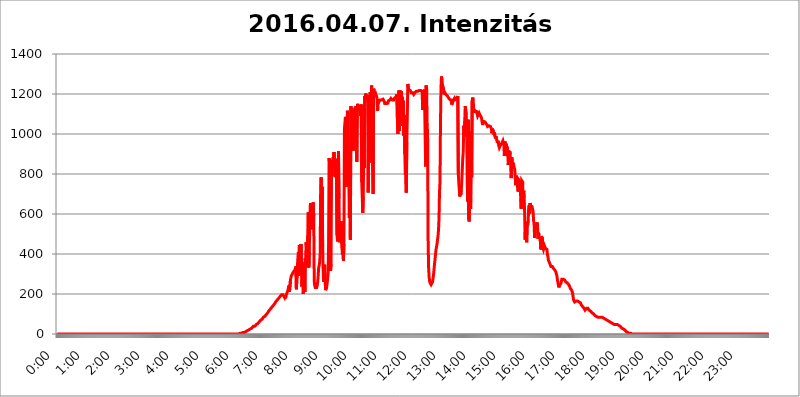
| Category | 2016.04.07. Intenzitás [W/m^2] |
|---|---|
| 0.0 | 0 |
| 0.0006944444444444445 | 0 |
| 0.001388888888888889 | 0 |
| 0.0020833333333333333 | 0 |
| 0.002777777777777778 | 0 |
| 0.003472222222222222 | 0 |
| 0.004166666666666667 | 0 |
| 0.004861111111111111 | 0 |
| 0.005555555555555556 | 0 |
| 0.0062499999999999995 | 0 |
| 0.006944444444444444 | 0 |
| 0.007638888888888889 | 0 |
| 0.008333333333333333 | 0 |
| 0.009027777777777779 | 0 |
| 0.009722222222222222 | 0 |
| 0.010416666666666666 | 0 |
| 0.011111111111111112 | 0 |
| 0.011805555555555555 | 0 |
| 0.012499999999999999 | 0 |
| 0.013194444444444444 | 0 |
| 0.013888888888888888 | 0 |
| 0.014583333333333332 | 0 |
| 0.015277777777777777 | 0 |
| 0.015972222222222224 | 0 |
| 0.016666666666666666 | 0 |
| 0.017361111111111112 | 0 |
| 0.018055555555555557 | 0 |
| 0.01875 | 0 |
| 0.019444444444444445 | 0 |
| 0.02013888888888889 | 0 |
| 0.020833333333333332 | 0 |
| 0.02152777777777778 | 0 |
| 0.022222222222222223 | 0 |
| 0.02291666666666667 | 0 |
| 0.02361111111111111 | 0 |
| 0.024305555555555556 | 0 |
| 0.024999999999999998 | 0 |
| 0.025694444444444447 | 0 |
| 0.02638888888888889 | 0 |
| 0.027083333333333334 | 0 |
| 0.027777777777777776 | 0 |
| 0.02847222222222222 | 0 |
| 0.029166666666666664 | 0 |
| 0.029861111111111113 | 0 |
| 0.030555555555555555 | 0 |
| 0.03125 | 0 |
| 0.03194444444444445 | 0 |
| 0.03263888888888889 | 0 |
| 0.03333333333333333 | 0 |
| 0.034027777777777775 | 0 |
| 0.034722222222222224 | 0 |
| 0.035416666666666666 | 0 |
| 0.036111111111111115 | 0 |
| 0.03680555555555556 | 0 |
| 0.0375 | 0 |
| 0.03819444444444444 | 0 |
| 0.03888888888888889 | 0 |
| 0.03958333333333333 | 0 |
| 0.04027777777777778 | 0 |
| 0.04097222222222222 | 0 |
| 0.041666666666666664 | 0 |
| 0.042361111111111106 | 0 |
| 0.04305555555555556 | 0 |
| 0.043750000000000004 | 0 |
| 0.044444444444444446 | 0 |
| 0.04513888888888889 | 0 |
| 0.04583333333333334 | 0 |
| 0.04652777777777778 | 0 |
| 0.04722222222222222 | 0 |
| 0.04791666666666666 | 0 |
| 0.04861111111111111 | 0 |
| 0.049305555555555554 | 0 |
| 0.049999999999999996 | 0 |
| 0.05069444444444445 | 0 |
| 0.051388888888888894 | 0 |
| 0.052083333333333336 | 0 |
| 0.05277777777777778 | 0 |
| 0.05347222222222222 | 0 |
| 0.05416666666666667 | 0 |
| 0.05486111111111111 | 0 |
| 0.05555555555555555 | 0 |
| 0.05625 | 0 |
| 0.05694444444444444 | 0 |
| 0.057638888888888885 | 0 |
| 0.05833333333333333 | 0 |
| 0.05902777777777778 | 0 |
| 0.059722222222222225 | 0 |
| 0.06041666666666667 | 0 |
| 0.061111111111111116 | 0 |
| 0.06180555555555556 | 0 |
| 0.0625 | 0 |
| 0.06319444444444444 | 0 |
| 0.06388888888888888 | 0 |
| 0.06458333333333334 | 0 |
| 0.06527777777777778 | 0 |
| 0.06597222222222222 | 0 |
| 0.06666666666666667 | 0 |
| 0.06736111111111111 | 0 |
| 0.06805555555555555 | 0 |
| 0.06874999999999999 | 0 |
| 0.06944444444444443 | 0 |
| 0.07013888888888889 | 0 |
| 0.07083333333333333 | 0 |
| 0.07152777777777779 | 0 |
| 0.07222222222222223 | 0 |
| 0.07291666666666667 | 0 |
| 0.07361111111111111 | 0 |
| 0.07430555555555556 | 0 |
| 0.075 | 0 |
| 0.07569444444444444 | 0 |
| 0.0763888888888889 | 0 |
| 0.07708333333333334 | 0 |
| 0.07777777777777778 | 0 |
| 0.07847222222222222 | 0 |
| 0.07916666666666666 | 0 |
| 0.0798611111111111 | 0 |
| 0.08055555555555556 | 0 |
| 0.08125 | 0 |
| 0.08194444444444444 | 0 |
| 0.08263888888888889 | 0 |
| 0.08333333333333333 | 0 |
| 0.08402777777777777 | 0 |
| 0.08472222222222221 | 0 |
| 0.08541666666666665 | 0 |
| 0.08611111111111112 | 0 |
| 0.08680555555555557 | 0 |
| 0.08750000000000001 | 0 |
| 0.08819444444444445 | 0 |
| 0.08888888888888889 | 0 |
| 0.08958333333333333 | 0 |
| 0.09027777777777778 | 0 |
| 0.09097222222222222 | 0 |
| 0.09166666666666667 | 0 |
| 0.09236111111111112 | 0 |
| 0.09305555555555556 | 0 |
| 0.09375 | 0 |
| 0.09444444444444444 | 0 |
| 0.09513888888888888 | 0 |
| 0.09583333333333333 | 0 |
| 0.09652777777777777 | 0 |
| 0.09722222222222222 | 0 |
| 0.09791666666666667 | 0 |
| 0.09861111111111111 | 0 |
| 0.09930555555555555 | 0 |
| 0.09999999999999999 | 0 |
| 0.10069444444444443 | 0 |
| 0.1013888888888889 | 0 |
| 0.10208333333333335 | 0 |
| 0.10277777777777779 | 0 |
| 0.10347222222222223 | 0 |
| 0.10416666666666667 | 0 |
| 0.10486111111111111 | 0 |
| 0.10555555555555556 | 0 |
| 0.10625 | 0 |
| 0.10694444444444444 | 0 |
| 0.1076388888888889 | 0 |
| 0.10833333333333334 | 0 |
| 0.10902777777777778 | 0 |
| 0.10972222222222222 | 0 |
| 0.1111111111111111 | 0 |
| 0.11180555555555556 | 0 |
| 0.11180555555555556 | 0 |
| 0.1125 | 0 |
| 0.11319444444444444 | 0 |
| 0.11388888888888889 | 0 |
| 0.11458333333333333 | 0 |
| 0.11527777777777777 | 0 |
| 0.11597222222222221 | 0 |
| 0.11666666666666665 | 0 |
| 0.1173611111111111 | 0 |
| 0.11805555555555557 | 0 |
| 0.11944444444444445 | 0 |
| 0.12013888888888889 | 0 |
| 0.12083333333333333 | 0 |
| 0.12152777777777778 | 0 |
| 0.12222222222222223 | 0 |
| 0.12291666666666667 | 0 |
| 0.12291666666666667 | 0 |
| 0.12361111111111112 | 0 |
| 0.12430555555555556 | 0 |
| 0.125 | 0 |
| 0.12569444444444444 | 0 |
| 0.12638888888888888 | 0 |
| 0.12708333333333333 | 0 |
| 0.16875 | 0 |
| 0.12847222222222224 | 0 |
| 0.12916666666666668 | 0 |
| 0.12986111111111112 | 0 |
| 0.13055555555555556 | 0 |
| 0.13125 | 0 |
| 0.13194444444444445 | 0 |
| 0.1326388888888889 | 0 |
| 0.13333333333333333 | 0 |
| 0.13402777777777777 | 0 |
| 0.13402777777777777 | 0 |
| 0.13472222222222222 | 0 |
| 0.13541666666666666 | 0 |
| 0.1361111111111111 | 0 |
| 0.13749999999999998 | 0 |
| 0.13819444444444443 | 0 |
| 0.1388888888888889 | 0 |
| 0.13958333333333334 | 0 |
| 0.14027777777777778 | 0 |
| 0.14097222222222222 | 0 |
| 0.14166666666666666 | 0 |
| 0.1423611111111111 | 0 |
| 0.14305555555555557 | 0 |
| 0.14375000000000002 | 0 |
| 0.14444444444444446 | 0 |
| 0.1451388888888889 | 0 |
| 0.1451388888888889 | 0 |
| 0.14652777777777778 | 0 |
| 0.14722222222222223 | 0 |
| 0.14791666666666667 | 0 |
| 0.1486111111111111 | 0 |
| 0.14930555555555555 | 0 |
| 0.15 | 0 |
| 0.15069444444444444 | 0 |
| 0.15138888888888888 | 0 |
| 0.15208333333333332 | 0 |
| 0.15277777777777776 | 0 |
| 0.15347222222222223 | 0 |
| 0.15416666666666667 | 0 |
| 0.15486111111111112 | 0 |
| 0.15555555555555556 | 0 |
| 0.15625 | 0 |
| 0.15694444444444444 | 0 |
| 0.15763888888888888 | 0 |
| 0.15833333333333333 | 0 |
| 0.15902777777777777 | 0 |
| 0.15972222222222224 | 0 |
| 0.16041666666666668 | 0 |
| 0.16111111111111112 | 0 |
| 0.16180555555555556 | 0 |
| 0.1625 | 0 |
| 0.16319444444444445 | 0 |
| 0.1638888888888889 | 0 |
| 0.16458333333333333 | 0 |
| 0.16527777777777777 | 0 |
| 0.16597222222222222 | 0 |
| 0.16666666666666666 | 0 |
| 0.1673611111111111 | 0 |
| 0.16805555555555554 | 0 |
| 0.16874999999999998 | 0 |
| 0.16944444444444443 | 0 |
| 0.17013888888888887 | 0 |
| 0.1708333333333333 | 0 |
| 0.17152777777777775 | 0 |
| 0.17222222222222225 | 0 |
| 0.1729166666666667 | 0 |
| 0.17361111111111113 | 0 |
| 0.17430555555555557 | 0 |
| 0.17500000000000002 | 0 |
| 0.17569444444444446 | 0 |
| 0.1763888888888889 | 0 |
| 0.17708333333333334 | 0 |
| 0.17777777777777778 | 0 |
| 0.17847222222222223 | 0 |
| 0.17916666666666667 | 0 |
| 0.1798611111111111 | 0 |
| 0.18055555555555555 | 0 |
| 0.18125 | 0 |
| 0.18194444444444444 | 0 |
| 0.1826388888888889 | 0 |
| 0.18333333333333335 | 0 |
| 0.1840277777777778 | 0 |
| 0.18472222222222223 | 0 |
| 0.18541666666666667 | 0 |
| 0.18611111111111112 | 0 |
| 0.18680555555555556 | 0 |
| 0.1875 | 0 |
| 0.18819444444444444 | 0 |
| 0.18888888888888888 | 0 |
| 0.18958333333333333 | 0 |
| 0.19027777777777777 | 0 |
| 0.1909722222222222 | 0 |
| 0.19166666666666665 | 0 |
| 0.19236111111111112 | 0 |
| 0.19305555555555554 | 0 |
| 0.19375 | 0 |
| 0.19444444444444445 | 0 |
| 0.1951388888888889 | 0 |
| 0.19583333333333333 | 0 |
| 0.19652777777777777 | 0 |
| 0.19722222222222222 | 0 |
| 0.19791666666666666 | 0 |
| 0.1986111111111111 | 0 |
| 0.19930555555555554 | 0 |
| 0.19999999999999998 | 0 |
| 0.20069444444444443 | 0 |
| 0.20138888888888887 | 0 |
| 0.2020833333333333 | 0 |
| 0.2027777777777778 | 0 |
| 0.2034722222222222 | 0 |
| 0.2041666666666667 | 0 |
| 0.20486111111111113 | 0 |
| 0.20555555555555557 | 0 |
| 0.20625000000000002 | 0 |
| 0.20694444444444446 | 0 |
| 0.2076388888888889 | 0 |
| 0.20833333333333334 | 0 |
| 0.20902777777777778 | 0 |
| 0.20972222222222223 | 0 |
| 0.21041666666666667 | 0 |
| 0.2111111111111111 | 0 |
| 0.21180555555555555 | 0 |
| 0.2125 | 0 |
| 0.21319444444444444 | 0 |
| 0.2138888888888889 | 0 |
| 0.21458333333333335 | 0 |
| 0.2152777777777778 | 0 |
| 0.21597222222222223 | 0 |
| 0.21666666666666667 | 0 |
| 0.21736111111111112 | 0 |
| 0.21805555555555556 | 0 |
| 0.21875 | 0 |
| 0.21944444444444444 | 0 |
| 0.22013888888888888 | 0 |
| 0.22083333333333333 | 0 |
| 0.22152777777777777 | 0 |
| 0.2222222222222222 | 0 |
| 0.22291666666666665 | 0 |
| 0.2236111111111111 | 0 |
| 0.22430555555555556 | 0 |
| 0.225 | 0 |
| 0.22569444444444445 | 0 |
| 0.2263888888888889 | 0 |
| 0.22708333333333333 | 0 |
| 0.22777777777777777 | 0 |
| 0.22847222222222222 | 0 |
| 0.22916666666666666 | 0 |
| 0.2298611111111111 | 0 |
| 0.23055555555555554 | 0 |
| 0.23124999999999998 | 0 |
| 0.23194444444444443 | 0 |
| 0.23263888888888887 | 0 |
| 0.2333333333333333 | 0 |
| 0.2340277777777778 | 0 |
| 0.2347222222222222 | 0 |
| 0.2354166666666667 | 0 |
| 0.23611111111111113 | 0 |
| 0.23680555555555557 | 0 |
| 0.23750000000000002 | 0 |
| 0.23819444444444446 | 0 |
| 0.2388888888888889 | 0 |
| 0.23958333333333334 | 0 |
| 0.24027777777777778 | 0 |
| 0.24097222222222223 | 0 |
| 0.24166666666666667 | 0 |
| 0.2423611111111111 | 0 |
| 0.24305555555555555 | 0 |
| 0.24375 | 0 |
| 0.24444444444444446 | 0 |
| 0.24513888888888888 | 0 |
| 0.24583333333333335 | 0 |
| 0.2465277777777778 | 0 |
| 0.24722222222222223 | 0 |
| 0.24791666666666667 | 0 |
| 0.24861111111111112 | 0 |
| 0.24930555555555556 | 0 |
| 0.25 | 0 |
| 0.25069444444444444 | 0 |
| 0.2513888888888889 | 0 |
| 0.2520833333333333 | 0 |
| 0.25277777777777777 | 0 |
| 0.2534722222222222 | 0 |
| 0.25416666666666665 | 0 |
| 0.2548611111111111 | 3.525 |
| 0.2555555555555556 | 3.525 |
| 0.25625000000000003 | 3.525 |
| 0.2569444444444445 | 3.525 |
| 0.2576388888888889 | 3.525 |
| 0.25833333333333336 | 3.525 |
| 0.2590277777777778 | 3.525 |
| 0.25972222222222224 | 3.525 |
| 0.2604166666666667 | 7.887 |
| 0.2611111111111111 | 7.887 |
| 0.26180555555555557 | 7.887 |
| 0.2625 | 7.887 |
| 0.26319444444444445 | 12.257 |
| 0.2638888888888889 | 12.257 |
| 0.26458333333333334 | 12.257 |
| 0.2652777777777778 | 12.257 |
| 0.2659722222222222 | 12.257 |
| 0.26666666666666666 | 16.636 |
| 0.2673611111111111 | 16.636 |
| 0.26805555555555555 | 21.024 |
| 0.26875 | 21.024 |
| 0.26944444444444443 | 21.024 |
| 0.2701388888888889 | 21.024 |
| 0.2708333333333333 | 25.419 |
| 0.27152777777777776 | 25.419 |
| 0.2722222222222222 | 29.823 |
| 0.27291666666666664 | 29.823 |
| 0.2736111111111111 | 34.234 |
| 0.2743055555555555 | 34.234 |
| 0.27499999999999997 | 38.653 |
| 0.27569444444444446 | 38.653 |
| 0.27638888888888885 | 38.653 |
| 0.27708333333333335 | 38.653 |
| 0.2777777777777778 | 43.079 |
| 0.27847222222222223 | 43.079 |
| 0.2791666666666667 | 47.511 |
| 0.2798611111111111 | 47.511 |
| 0.28055555555555556 | 51.951 |
| 0.28125 | 51.951 |
| 0.28194444444444444 | 56.398 |
| 0.2826388888888889 | 56.398 |
| 0.2833333333333333 | 60.85 |
| 0.28402777777777777 | 60.85 |
| 0.2847222222222222 | 65.31 |
| 0.28541666666666665 | 69.775 |
| 0.28611111111111115 | 69.775 |
| 0.28680555555555554 | 74.246 |
| 0.28750000000000003 | 74.246 |
| 0.2881944444444445 | 78.722 |
| 0.2888888888888889 | 83.205 |
| 0.28958333333333336 | 83.205 |
| 0.2902777777777778 | 87.692 |
| 0.29097222222222224 | 87.692 |
| 0.2916666666666667 | 92.184 |
| 0.2923611111111111 | 92.184 |
| 0.29305555555555557 | 96.682 |
| 0.29375 | 101.184 |
| 0.29444444444444445 | 101.184 |
| 0.2951388888888889 | 105.69 |
| 0.29583333333333334 | 110.201 |
| 0.2965277777777778 | 114.716 |
| 0.2972222222222222 | 114.716 |
| 0.29791666666666666 | 119.235 |
| 0.2986111111111111 | 123.758 |
| 0.29930555555555555 | 123.758 |
| 0.3 | 128.284 |
| 0.30069444444444443 | 132.814 |
| 0.3013888888888889 | 132.814 |
| 0.3020833333333333 | 137.347 |
| 0.30277777777777776 | 141.884 |
| 0.3034722222222222 | 146.423 |
| 0.30416666666666664 | 146.423 |
| 0.3048611111111111 | 150.964 |
| 0.3055555555555555 | 155.509 |
| 0.30624999999999997 | 160.056 |
| 0.3069444444444444 | 164.605 |
| 0.3076388888888889 | 164.605 |
| 0.30833333333333335 | 169.156 |
| 0.3090277777777778 | 173.709 |
| 0.30972222222222223 | 173.709 |
| 0.3104166666666667 | 178.264 |
| 0.3111111111111111 | 182.82 |
| 0.31180555555555556 | 178.264 |
| 0.3125 | 187.378 |
| 0.31319444444444444 | 187.378 |
| 0.3138888888888889 | 191.937 |
| 0.3145833333333333 | 196.497 |
| 0.31527777777777777 | 196.497 |
| 0.3159722222222222 | 201.058 |
| 0.31666666666666665 | 196.497 |
| 0.31736111111111115 | 191.937 |
| 0.31805555555555554 | 191.937 |
| 0.31875000000000003 | 182.82 |
| 0.3194444444444445 | 191.937 |
| 0.3201388888888889 | 178.264 |
| 0.32083333333333336 | 191.937 |
| 0.3215277777777778 | 196.497 |
| 0.32222222222222224 | 205.62 |
| 0.3229166666666667 | 210.182 |
| 0.3236111111111111 | 219.309 |
| 0.32430555555555557 | 233 |
| 0.325 | 242.127 |
| 0.32569444444444445 | 210.182 |
| 0.3263888888888889 | 210.182 |
| 0.32708333333333334 | 269.49 |
| 0.3277777777777778 | 283.156 |
| 0.3284722222222222 | 292.259 |
| 0.32916666666666666 | 296.808 |
| 0.3298611111111111 | 301.354 |
| 0.33055555555555555 | 305.898 |
| 0.33125 | 310.44 |
| 0.33194444444444443 | 310.44 |
| 0.3326388888888889 | 314.98 |
| 0.3333333333333333 | 319.517 |
| 0.3340277777777778 | 328.584 |
| 0.3347222222222222 | 337.639 |
| 0.3354166666666667 | 223.873 |
| 0.3361111111111111 | 228.436 |
| 0.3368055555555556 | 337.639 |
| 0.33749999999999997 | 378.224 |
| 0.33819444444444446 | 409.574 |
| 0.33888888888888885 | 292.259 |
| 0.33958333333333335 | 445.129 |
| 0.34027777777777773 | 449.551 |
| 0.34097222222222223 | 296.808 |
| 0.3416666666666666 | 449.551 |
| 0.3423611111111111 | 431.833 |
| 0.3430555555555555 | 237.564 |
| 0.34375 | 296.808 |
| 0.3444444444444445 | 360.221 |
| 0.3451388888888889 | 201.058 |
| 0.3458333333333334 | 292.259 |
| 0.34652777777777777 | 360.221 |
| 0.34722222222222227 | 210.182 |
| 0.34791666666666665 | 378.224 |
| 0.34861111111111115 | 342.162 |
| 0.34930555555555554 | 458.38 |
| 0.35000000000000003 | 346.682 |
| 0.3506944444444444 | 333.113 |
| 0.3513888888888889 | 493.475 |
| 0.3520833333333333 | 609.062 |
| 0.3527777777777778 | 333.113 |
| 0.3534722222222222 | 414.035 |
| 0.3541666666666667 | 414.035 |
| 0.3548611111111111 | 642.4 |
| 0.35555555555555557 | 654.791 |
| 0.35625 | 658.909 |
| 0.35694444444444445 | 523.88 |
| 0.3576388888888889 | 532.513 |
| 0.35833333333333334 | 575.299 |
| 0.3590277777777778 | 658.909 |
| 0.3597222222222222 | 588.009 |
| 0.36041666666666666 | 264.932 |
| 0.3611111111111111 | 242.127 |
| 0.36180555555555555 | 233 |
| 0.3625 | 228.436 |
| 0.36319444444444443 | 228.436 |
| 0.3638888888888889 | 233 |
| 0.3645833333333333 | 242.127 |
| 0.3652777777777778 | 260.373 |
| 0.3659722222222222 | 292.259 |
| 0.3666666666666667 | 333.113 |
| 0.3673611111111111 | 342.162 |
| 0.3680555555555556 | 360.221 |
| 0.36874999999999997 | 400.638 |
| 0.36944444444444446 | 719.877 |
| 0.37013888888888885 | 783.342 |
| 0.37083333333333335 | 536.82 |
| 0.37152777777777773 | 735.89 |
| 0.37222222222222223 | 436.27 |
| 0.3729166666666666 | 319.517 |
| 0.3736111111111111 | 260.373 |
| 0.3743055555555555 | 260.373 |
| 0.375 | 346.682 |
| 0.3756944444444445 | 269.49 |
| 0.3763888888888889 | 219.309 |
| 0.3770833333333334 | 223.873 |
| 0.37777777777777777 | 233 |
| 0.37847222222222227 | 251.251 |
| 0.37916666666666665 | 274.047 |
| 0.37986111111111115 | 301.354 |
| 0.38055555555555554 | 449.551 |
| 0.38125000000000003 | 879.719 |
| 0.3819444444444444 | 856.855 |
| 0.3826388888888889 | 373.729 |
| 0.3833333333333333 | 314.98 |
| 0.3840277777777778 | 351.198 |
| 0.3847222222222222 | 826.123 |
| 0.3854166666666667 | 853.029 |
| 0.3861111111111111 | 864.493 |
| 0.38680555555555557 | 883.516 |
| 0.3875 | 875.918 |
| 0.38819444444444445 | 909.996 |
| 0.3888888888888889 | 909.996 |
| 0.38958333333333334 | 787.258 |
| 0.3902777777777778 | 875.918 |
| 0.3909722222222222 | 783.342 |
| 0.39166666666666666 | 810.641 |
| 0.3923611111111111 | 493.475 |
| 0.39305555555555555 | 462.786 |
| 0.39375 | 480.356 |
| 0.39444444444444443 | 913.766 |
| 0.3951388888888889 | 675.311 |
| 0.3958333333333333 | 458.38 |
| 0.3965277777777778 | 458.38 |
| 0.3972222222222222 | 493.475 |
| 0.3979166666666667 | 475.972 |
| 0.3986111111111111 | 562.53 |
| 0.3993055555555556 | 431.833 |
| 0.39999999999999997 | 396.164 |
| 0.40069444444444446 | 440.702 |
| 0.40138888888888885 | 364.728 |
| 0.40208333333333335 | 449.551 |
| 0.40277777777777773 | 1026.06 |
| 0.40347222222222223 | 1056.004 |
| 0.4041666666666666 | 1086.097 |
| 0.4048611111111111 | 1074.789 |
| 0.4055555555555555 | 735.89 |
| 0.40625 | 909.996 |
| 0.4069444444444445 | 1116.426 |
| 0.4076388888888889 | 1089.873 |
| 0.4083333333333334 | 791.169 |
| 0.40902777777777777 | 747.834 |
| 0.40972222222222227 | 579.542 |
| 0.41041666666666665 | 898.668 |
| 0.41111111111111115 | 471.582 |
| 0.41180555555555554 | 1139.384 |
| 0.41250000000000003 | 1116.426 |
| 0.4131944444444444 | 1044.762 |
| 0.4138888888888889 | 1116.426 |
| 0.4145833333333333 | 1120.238 |
| 0.4152777777777778 | 917.534 |
| 0.4159722222222222 | 1120.238 |
| 0.4166666666666667 | 1116.426 |
| 0.4173611111111111 | 1120.238 |
| 0.41805555555555557 | 1131.708 |
| 0.41875 | 1139.384 |
| 0.41944444444444445 | 1105.019 |
| 0.4201388888888889 | 860.676 |
| 0.42083333333333334 | 1135.543 |
| 0.4215277777777778 | 1150.946 |
| 0.4222222222222222 | 1116.426 |
| 0.42291666666666666 | 1139.384 |
| 0.4236111111111111 | 1131.708 |
| 0.42430555555555555 | 1135.543 |
| 0.425 | 1143.232 |
| 0.42569444444444443 | 1089.873 |
| 0.4263888888888889 | 1147.086 |
| 0.4270833333333333 | 759.723 |
| 0.4277777777777778 | 683.473 |
| 0.4284722222222222 | 604.864 |
| 0.4291666666666667 | 687.544 |
| 0.4298611111111111 | 894.885 |
| 0.4305555555555556 | 829.981 |
| 0.43124999999999997 | 1189.969 |
| 0.43194444444444446 | 1170.358 |
| 0.43263888888888885 | 1201.843 |
| 0.43333333333333335 | 1205.82 |
| 0.43402777777777773 | 1182.099 |
| 0.43472222222222223 | 1193.918 |
| 0.4354166666666666 | 1162.571 |
| 0.4361111111111111 | 707.8 |
| 0.4368055555555555 | 1101.226 |
| 0.4375 | 856.855 |
| 0.4381944444444445 | 951.327 |
| 0.4388888888888889 | 1209.807 |
| 0.4395833333333334 | 1120.238 |
| 0.44027777777777777 | 1124.056 |
| 0.44097222222222227 | 1242.089 |
| 0.44166666666666665 | 1033.537 |
| 0.44236111111111115 | 814.519 |
| 0.44305555555555554 | 699.717 |
| 0.44375000000000003 | 1225.859 |
| 0.4444444444444444 | 1217.812 |
| 0.4451388888888889 | 1209.807 |
| 0.4458333333333333 | 1205.82 |
| 0.4465277777777778 | 1186.03 |
| 0.4472222222222222 | 1193.918 |
| 0.4479166666666667 | 1189.969 |
| 0.4486111111111111 | 1178.177 |
| 0.44930555555555557 | 1116.426 |
| 0.45 | 1174.263 |
| 0.45069444444444445 | 1158.689 |
| 0.4513888888888889 | 1162.571 |
| 0.45208333333333334 | 1162.571 |
| 0.4527777777777778 | 1170.358 |
| 0.4534722222222222 | 1166.46 |
| 0.45416666666666666 | 1166.46 |
| 0.4548611111111111 | 1170.358 |
| 0.45555555555555555 | 1174.263 |
| 0.45625 | 1174.263 |
| 0.45694444444444443 | 1174.263 |
| 0.4576388888888889 | 1174.263 |
| 0.4583333333333333 | 1170.358 |
| 0.4590277777777778 | 1158.689 |
| 0.4597222222222222 | 1147.086 |
| 0.4604166666666667 | 1158.689 |
| 0.4611111111111111 | 1147.086 |
| 0.4618055555555556 | 1154.814 |
| 0.46249999999999997 | 1154.814 |
| 0.46319444444444446 | 1158.689 |
| 0.46388888888888885 | 1154.814 |
| 0.46458333333333335 | 1166.46 |
| 0.46527777777777773 | 1170.358 |
| 0.46597222222222223 | 1166.46 |
| 0.4666666666666666 | 1170.358 |
| 0.4673611111111111 | 1174.263 |
| 0.4680555555555555 | 1178.177 |
| 0.46875 | 1178.177 |
| 0.4694444444444445 | 1174.263 |
| 0.4701388888888889 | 1170.358 |
| 0.4708333333333334 | 1170.358 |
| 0.47152777777777777 | 1170.358 |
| 0.47222222222222227 | 1170.358 |
| 0.47291666666666665 | 1178.177 |
| 0.47361111111111115 | 1182.099 |
| 0.47430555555555554 | 1182.099 |
| 0.47500000000000003 | 1186.03 |
| 0.4756944444444444 | 1189.969 |
| 0.4763888888888889 | 1197.876 |
| 0.4770833333333333 | 1074.789 |
| 0.4777777777777778 | 999.916 |
| 0.4784722222222222 | 1112.618 |
| 0.4791666666666667 | 1217.812 |
| 0.4798611111111111 | 1014.852 |
| 0.48055555555555557 | 1217.812 |
| 0.48125 | 1205.82 |
| 0.48194444444444445 | 1124.056 |
| 0.4826388888888889 | 1213.804 |
| 0.48333333333333334 | 1154.814 |
| 0.4840277777777778 | 1186.03 |
| 0.4847222222222222 | 1041.019 |
| 0.48541666666666666 | 1166.46 |
| 0.4861111111111111 | 992.448 |
| 0.48680555555555555 | 1093.653 |
| 0.4875 | 898.668 |
| 0.48819444444444443 | 795.074 |
| 0.4888888888888889 | 814.519 |
| 0.4895833333333333 | 707.8 |
| 0.4902777777777778 | 962.555 |
| 0.4909722222222222 | 1089.873 |
| 0.4916666666666667 | 1250.275 |
| 0.4923611111111111 | 1233.951 |
| 0.4930555555555556 | 1221.83 |
| 0.49374999999999997 | 1221.83 |
| 0.49444444444444446 | 1221.83 |
| 0.49513888888888885 | 1217.812 |
| 0.49583333333333335 | 1213.804 |
| 0.49652777777777773 | 1205.82 |
| 0.49722222222222223 | 1205.82 |
| 0.4979166666666666 | 1209.807 |
| 0.4986111111111111 | 1205.82 |
| 0.4993055555555555 | 1201.843 |
| 0.5 | 1197.876 |
| 0.5006944444444444 | 1201.843 |
| 0.5013888888888889 | 1205.82 |
| 0.5020833333333333 | 1201.843 |
| 0.5027777777777778 | 1209.807 |
| 0.5034722222222222 | 1213.804 |
| 0.5041666666666667 | 1217.812 |
| 0.5048611111111111 | 1209.807 |
| 0.5055555555555555 | 1213.804 |
| 0.50625 | 1217.812 |
| 0.5069444444444444 | 1217.812 |
| 0.5076388888888889 | 1217.812 |
| 0.5083333333333333 | 1217.812 |
| 0.5090277777777777 | 1217.812 |
| 0.5097222222222222 | 1217.812 |
| 0.5104166666666666 | 1221.83 |
| 0.5111111111111112 | 1221.83 |
| 0.5118055555555555 | 1209.807 |
| 0.5125000000000001 | 1120.238 |
| 0.5131944444444444 | 1186.03 |
| 0.513888888888889 | 1150.946 |
| 0.5145833333333333 | 1221.83 |
| 0.5152777777777778 | 1150.946 |
| 0.5159722222222222 | 1150.946 |
| 0.5166666666666667 | 837.682 |
| 0.517361111111111 | 1242.089 |
| 0.5180555555555556 | 1229.899 |
| 0.5187499999999999 | 1056.004 |
| 0.5194444444444445 | 996.182 |
| 0.5201388888888888 | 471.582 |
| 0.5208333333333334 | 333.113 |
| 0.5215277777777778 | 287.709 |
| 0.5222222222222223 | 264.932 |
| 0.5229166666666667 | 255.813 |
| 0.5236111111111111 | 251.251 |
| 0.5243055555555556 | 246.689 |
| 0.525 | 246.689 |
| 0.5256944444444445 | 251.251 |
| 0.5263888888888889 | 260.373 |
| 0.5270833333333333 | 278.603 |
| 0.5277777777777778 | 296.808 |
| 0.5284722222222222 | 324.052 |
| 0.5291666666666667 | 351.198 |
| 0.5298611111111111 | 373.729 |
| 0.5305555555555556 | 400.638 |
| 0.53125 | 422.943 |
| 0.5319444444444444 | 436.27 |
| 0.5326388888888889 | 449.551 |
| 0.5333333333333333 | 471.582 |
| 0.5340277777777778 | 489.108 |
| 0.5347222222222222 | 519.555 |
| 0.5354166666666667 | 575.299 |
| 0.5361111111111111 | 707.8 |
| 0.5368055555555555 | 759.723 |
| 0.5375 | 1052.255 |
| 0.5381944444444444 | 1229.899 |
| 0.5388888888888889 | 1287.761 |
| 0.5395833333333333 | 1270.964 |
| 0.5402777777777777 | 1246.176 |
| 0.5409722222222222 | 1238.014 |
| 0.5416666666666666 | 1229.899 |
| 0.5423611111111112 | 1197.876 |
| 0.5430555555555555 | 1209.807 |
| 0.5437500000000001 | 1213.804 |
| 0.5444444444444444 | 1205.82 |
| 0.545138888888889 | 1197.876 |
| 0.5458333333333333 | 1197.876 |
| 0.5465277777777778 | 1193.918 |
| 0.5472222222222222 | 1189.969 |
| 0.5479166666666667 | 1189.969 |
| 0.548611111111111 | 1182.099 |
| 0.5493055555555556 | 1178.177 |
| 0.5499999999999999 | 1174.263 |
| 0.5506944444444445 | 1178.177 |
| 0.5513888888888888 | 1178.177 |
| 0.5520833333333334 | 1170.358 |
| 0.5527777777777778 | 1170.358 |
| 0.5534722222222223 | 1147.086 |
| 0.5541666666666667 | 1170.358 |
| 0.5548611111111111 | 1162.571 |
| 0.5555555555555556 | 1170.358 |
| 0.55625 | 1166.46 |
| 0.5569444444444445 | 1178.177 |
| 0.5576388888888889 | 1170.358 |
| 0.5583333333333333 | 1166.46 |
| 0.5590277777777778 | 1170.358 |
| 0.5597222222222222 | 1174.263 |
| 0.5604166666666667 | 1178.177 |
| 0.5611111111111111 | 1174.263 |
| 0.5618055555555556 | 1189.969 |
| 0.5625 | 802.868 |
| 0.5631944444444444 | 755.766 |
| 0.5638888888888889 | 755.766 |
| 0.5645833333333333 | 687.544 |
| 0.5652777777777778 | 703.762 |
| 0.5659722222222222 | 695.666 |
| 0.5666666666666667 | 719.877 |
| 0.5673611111111111 | 767.62 |
| 0.5680555555555555 | 818.392 |
| 0.56875 | 879.719 |
| 0.5694444444444444 | 909.996 |
| 0.5701388888888889 | 1041.019 |
| 0.5708333333333333 | 988.714 |
| 0.5715277777777777 | 1063.51 |
| 0.5722222222222222 | 1139.384 |
| 0.5729166666666666 | 1135.543 |
| 0.5736111111111112 | 1097.437 |
| 0.5743055555555555 | 1029.798 |
| 0.5750000000000001 | 751.803 |
| 0.5756944444444444 | 663.019 |
| 0.576388888888889 | 1071.027 |
| 0.5770833333333333 | 575.299 |
| 0.5777777777777778 | 562.53 |
| 0.5784722222222222 | 679.395 |
| 0.5791666666666667 | 642.4 |
| 0.579861111111111 | 625.784 |
| 0.5805555555555556 | 1011.118 |
| 0.5812499999999999 | 783.342 |
| 0.5819444444444445 | 1166.46 |
| 0.5826388888888888 | 1182.099 |
| 0.5833333333333334 | 1170.358 |
| 0.5840277777777778 | 1127.879 |
| 0.5847222222222223 | 1131.708 |
| 0.5854166666666667 | 1105.019 |
| 0.5861111111111111 | 1116.426 |
| 0.5868055555555556 | 1120.238 |
| 0.5875 | 1112.618 |
| 0.5881944444444445 | 1112.618 |
| 0.5888888888888889 | 1108.816 |
| 0.5895833333333333 | 1089.873 |
| 0.5902777777777778 | 1086.097 |
| 0.5909722222222222 | 1089.873 |
| 0.5916666666666667 | 1105.019 |
| 0.5923611111111111 | 1101.226 |
| 0.5930555555555556 | 1093.653 |
| 0.59375 | 1093.653 |
| 0.5944444444444444 | 1086.097 |
| 0.5951388888888889 | 1078.555 |
| 0.5958333333333333 | 1078.555 |
| 0.5965277777777778 | 1044.762 |
| 0.5972222222222222 | 1067.267 |
| 0.5979166666666667 | 1059.756 |
| 0.5986111111111111 | 1063.51 |
| 0.5993055555555555 | 1063.51 |
| 0.6 | 1059.756 |
| 0.6006944444444444 | 1059.756 |
| 0.6013888888888889 | 1052.255 |
| 0.6020833333333333 | 1052.255 |
| 0.6027777777777777 | 1044.762 |
| 0.6034722222222222 | 1037.277 |
| 0.6041666666666666 | 1033.537 |
| 0.6048611111111112 | 1037.277 |
| 0.6055555555555555 | 1041.019 |
| 0.6062500000000001 | 1044.762 |
| 0.6069444444444444 | 1044.762 |
| 0.607638888888889 | 1037.277 |
| 0.6083333333333333 | 1033.537 |
| 0.6090277777777778 | 1026.06 |
| 0.6097222222222222 | 1003.65 |
| 0.6104166666666667 | 1026.06 |
| 0.611111111111111 | 1022.323 |
| 0.6118055555555556 | 1011.118 |
| 0.6124999999999999 | 996.182 |
| 0.6131944444444445 | 1007.383 |
| 0.6138888888888888 | 988.714 |
| 0.6145833333333334 | 977.508 |
| 0.6152777777777778 | 988.714 |
| 0.6159722222222223 | 977.508 |
| 0.6166666666666667 | 977.508 |
| 0.6173611111111111 | 955.071 |
| 0.6180555555555556 | 966.295 |
| 0.61875 | 970.034 |
| 0.6194444444444445 | 970.034 |
| 0.6201388888888889 | 932.576 |
| 0.6208333333333333 | 932.576 |
| 0.6215277777777778 | 943.832 |
| 0.6222222222222222 | 947.58 |
| 0.6229166666666667 | 951.327 |
| 0.6236111111111111 | 951.327 |
| 0.6243055555555556 | 947.58 |
| 0.625 | 966.295 |
| 0.6256944444444444 | 966.295 |
| 0.6263888888888889 | 943.832 |
| 0.6270833333333333 | 891.099 |
| 0.6277777777777778 | 962.555 |
| 0.6284722222222222 | 958.814 |
| 0.6291666666666667 | 932.576 |
| 0.6298611111111111 | 951.327 |
| 0.6305555555555555 | 891.099 |
| 0.63125 | 936.33 |
| 0.6319444444444444 | 891.099 |
| 0.6326388888888889 | 845.365 |
| 0.6333333333333333 | 917.534 |
| 0.6340277777777777 | 879.719 |
| 0.6347222222222222 | 913.766 |
| 0.6354166666666666 | 868.305 |
| 0.6361111111111112 | 883.516 |
| 0.6368055555555555 | 779.42 |
| 0.6375000000000001 | 883.516 |
| 0.6381944444444444 | 841.526 |
| 0.638888888888889 | 841.526 |
| 0.6395833333333333 | 856.855 |
| 0.6402777777777778 | 841.526 |
| 0.6409722222222222 | 845.365 |
| 0.6416666666666667 | 822.26 |
| 0.642361111111111 | 818.392 |
| 0.6430555555555556 | 743.859 |
| 0.6437499999999999 | 791.169 |
| 0.6444444444444445 | 783.342 |
| 0.6451388888888888 | 763.674 |
| 0.6458333333333334 | 723.889 |
| 0.6465277777777778 | 711.832 |
| 0.6472222222222223 | 751.803 |
| 0.6479166666666667 | 767.62 |
| 0.6486111111111111 | 771.559 |
| 0.6493055555555556 | 759.723 |
| 0.65 | 679.395 |
| 0.6506944444444445 | 625.784 |
| 0.6513888888888889 | 767.62 |
| 0.6520833333333333 | 767.62 |
| 0.6527777777777778 | 759.723 |
| 0.6534722222222222 | 638.256 |
| 0.6541666666666667 | 715.858 |
| 0.6548611111111111 | 683.473 |
| 0.6555555555555556 | 604.864 |
| 0.65625 | 471.582 |
| 0.6569444444444444 | 553.986 |
| 0.6576388888888889 | 562.53 |
| 0.6583333333333333 | 458.38 |
| 0.6590277777777778 | 532.513 |
| 0.6597222222222222 | 528.2 |
| 0.6604166666666667 | 553.986 |
| 0.6611111111111111 | 621.613 |
| 0.6618055555555555 | 642.4 |
| 0.6625 | 600.661 |
| 0.6631944444444444 | 654.791 |
| 0.6638888888888889 | 654.791 |
| 0.6645833333333333 | 629.948 |
| 0.6652777777777777 | 642.4 |
| 0.6659722222222222 | 634.105 |
| 0.6666666666666666 | 629.948 |
| 0.6673611111111111 | 613.252 |
| 0.6680555555555556 | 566.793 |
| 0.6687500000000001 | 553.986 |
| 0.6694444444444444 | 480.356 |
| 0.6701388888888888 | 493.475 |
| 0.6708333333333334 | 532.513 |
| 0.6715277777777778 | 523.88 |
| 0.6722222222222222 | 549.704 |
| 0.6729166666666666 | 558.261 |
| 0.6736111111111112 | 541.121 |
| 0.6743055555555556 | 475.972 |
| 0.6749999999999999 | 506.542 |
| 0.6756944444444444 | 493.475 |
| 0.6763888888888889 | 475.972 |
| 0.6770833333333334 | 489.108 |
| 0.6777777777777777 | 493.475 |
| 0.6784722222222223 | 422.943 |
| 0.6791666666666667 | 489.108 |
| 0.6798611111111111 | 489.108 |
| 0.6805555555555555 | 475.972 |
| 0.68125 | 431.833 |
| 0.6819444444444445 | 422.943 |
| 0.6826388888888889 | 427.39 |
| 0.6833333333333332 | 440.702 |
| 0.6840277777777778 | 440.702 |
| 0.6847222222222222 | 427.39 |
| 0.6854166666666667 | 431.833 |
| 0.686111111111111 | 427.39 |
| 0.6868055555555556 | 422.943 |
| 0.6875 | 396.164 |
| 0.6881944444444444 | 387.202 |
| 0.688888888888889 | 369.23 |
| 0.6895833333333333 | 364.728 |
| 0.6902777777777778 | 364.728 |
| 0.6909722222222222 | 351.198 |
| 0.6916666666666668 | 351.198 |
| 0.6923611111111111 | 337.639 |
| 0.6930555555555555 | 333.113 |
| 0.69375 | 342.162 |
| 0.6944444444444445 | 337.639 |
| 0.6951388888888889 | 333.113 |
| 0.6958333333333333 | 328.584 |
| 0.6965277777777777 | 324.052 |
| 0.6972222222222223 | 324.052 |
| 0.6979166666666666 | 319.517 |
| 0.6986111111111111 | 314.98 |
| 0.6993055555555556 | 310.44 |
| 0.7000000000000001 | 305.898 |
| 0.7006944444444444 | 292.259 |
| 0.7013888888888888 | 274.047 |
| 0.7020833333333334 | 260.373 |
| 0.7027777777777778 | 246.689 |
| 0.7034722222222222 | 233 |
| 0.7041666666666666 | 242.127 |
| 0.7048611111111112 | 237.564 |
| 0.7055555555555556 | 242.127 |
| 0.7062499999999999 | 251.251 |
| 0.7069444444444444 | 260.373 |
| 0.7076388888888889 | 274.047 |
| 0.7083333333333334 | 274.047 |
| 0.7090277777777777 | 274.047 |
| 0.7097222222222223 | 274.047 |
| 0.7104166666666667 | 274.047 |
| 0.7111111111111111 | 269.49 |
| 0.7118055555555555 | 269.49 |
| 0.7125 | 264.932 |
| 0.7131944444444445 | 260.373 |
| 0.7138888888888889 | 260.373 |
| 0.7145833333333332 | 260.373 |
| 0.7152777777777778 | 255.813 |
| 0.7159722222222222 | 255.813 |
| 0.7166666666666667 | 251.251 |
| 0.717361111111111 | 246.689 |
| 0.7180555555555556 | 242.127 |
| 0.71875 | 237.564 |
| 0.7194444444444444 | 228.436 |
| 0.720138888888889 | 228.436 |
| 0.7208333333333333 | 223.873 |
| 0.7215277777777778 | 219.309 |
| 0.7222222222222222 | 214.746 |
| 0.7229166666666668 | 201.058 |
| 0.7236111111111111 | 182.82 |
| 0.7243055555555555 | 169.156 |
| 0.725 | 164.605 |
| 0.7256944444444445 | 160.056 |
| 0.7263888888888889 | 155.509 |
| 0.7270833333333333 | 155.509 |
| 0.7277777777777777 | 164.605 |
| 0.7284722222222223 | 164.605 |
| 0.7291666666666666 | 164.605 |
| 0.7298611111111111 | 164.605 |
| 0.7305555555555556 | 164.605 |
| 0.7312500000000001 | 164.605 |
| 0.7319444444444444 | 160.056 |
| 0.7326388888888888 | 155.509 |
| 0.7333333333333334 | 160.056 |
| 0.7340277777777778 | 155.509 |
| 0.7347222222222222 | 146.423 |
| 0.7354166666666666 | 146.423 |
| 0.7361111111111112 | 141.884 |
| 0.7368055555555556 | 137.347 |
| 0.7374999999999999 | 137.347 |
| 0.7381944444444444 | 132.814 |
| 0.7388888888888889 | 128.284 |
| 0.7395833333333334 | 128.284 |
| 0.7402777777777777 | 119.235 |
| 0.7409722222222223 | 123.758 |
| 0.7416666666666667 | 123.758 |
| 0.7423611111111111 | 128.284 |
| 0.7430555555555555 | 128.284 |
| 0.74375 | 132.814 |
| 0.7444444444444445 | 128.284 |
| 0.7451388888888889 | 123.758 |
| 0.7458333333333332 | 119.235 |
| 0.7465277777777778 | 119.235 |
| 0.7472222222222222 | 119.235 |
| 0.7479166666666667 | 114.716 |
| 0.748611111111111 | 110.201 |
| 0.7493055555555556 | 110.201 |
| 0.75 | 105.69 |
| 0.7506944444444444 | 105.69 |
| 0.751388888888889 | 101.184 |
| 0.7520833333333333 | 101.184 |
| 0.7527777777777778 | 101.184 |
| 0.7534722222222222 | 96.682 |
| 0.7541666666666668 | 92.184 |
| 0.7548611111111111 | 92.184 |
| 0.7555555555555555 | 92.184 |
| 0.75625 | 87.692 |
| 0.7569444444444445 | 83.205 |
| 0.7576388888888889 | 83.205 |
| 0.7583333333333333 | 83.205 |
| 0.7590277777777777 | 83.205 |
| 0.7597222222222223 | 83.205 |
| 0.7604166666666666 | 83.205 |
| 0.7611111111111111 | 83.205 |
| 0.7618055555555556 | 83.205 |
| 0.7625000000000001 | 83.205 |
| 0.7631944444444444 | 83.205 |
| 0.7638888888888888 | 83.205 |
| 0.7645833333333334 | 83.205 |
| 0.7652777777777778 | 83.205 |
| 0.7659722222222222 | 83.205 |
| 0.7666666666666666 | 78.722 |
| 0.7673611111111112 | 78.722 |
| 0.7680555555555556 | 78.722 |
| 0.7687499999999999 | 74.246 |
| 0.7694444444444444 | 74.246 |
| 0.7701388888888889 | 74.246 |
| 0.7708333333333334 | 69.775 |
| 0.7715277777777777 | 69.775 |
| 0.7722222222222223 | 69.775 |
| 0.7729166666666667 | 65.31 |
| 0.7736111111111111 | 65.31 |
| 0.7743055555555555 | 65.31 |
| 0.775 | 60.85 |
| 0.7756944444444445 | 60.85 |
| 0.7763888888888889 | 56.398 |
| 0.7770833333333332 | 56.398 |
| 0.7777777777777778 | 56.398 |
| 0.7784722222222222 | 56.398 |
| 0.7791666666666667 | 51.951 |
| 0.779861111111111 | 51.951 |
| 0.7805555555555556 | 51.951 |
| 0.78125 | 47.511 |
| 0.7819444444444444 | 47.511 |
| 0.782638888888889 | 47.511 |
| 0.7833333333333333 | 47.511 |
| 0.7840277777777778 | 47.511 |
| 0.7847222222222222 | 47.511 |
| 0.7854166666666668 | 47.511 |
| 0.7861111111111111 | 43.079 |
| 0.7868055555555555 | 43.079 |
| 0.7875 | 43.079 |
| 0.7881944444444445 | 38.653 |
| 0.7888888888888889 | 38.653 |
| 0.7895833333333333 | 38.653 |
| 0.7902777777777777 | 38.653 |
| 0.7909722222222223 | 34.234 |
| 0.7916666666666666 | 29.823 |
| 0.7923611111111111 | 29.823 |
| 0.7930555555555556 | 29.823 |
| 0.7937500000000001 | 25.419 |
| 0.7944444444444444 | 21.024 |
| 0.7951388888888888 | 21.024 |
| 0.7958333333333334 | 21.024 |
| 0.7965277777777778 | 16.636 |
| 0.7972222222222222 | 16.636 |
| 0.7979166666666666 | 12.257 |
| 0.7986111111111112 | 12.257 |
| 0.7993055555555556 | 12.257 |
| 0.7999999999999999 | 7.887 |
| 0.8006944444444444 | 7.887 |
| 0.8013888888888889 | 7.887 |
| 0.8020833333333334 | 3.525 |
| 0.8027777777777777 | 3.525 |
| 0.8034722222222223 | 3.525 |
| 0.8041666666666667 | 3.525 |
| 0.8048611111111111 | 3.525 |
| 0.8055555555555555 | 3.525 |
| 0.80625 | 0 |
| 0.8069444444444445 | 0 |
| 0.8076388888888889 | 0 |
| 0.8083333333333332 | 0 |
| 0.8090277777777778 | 0 |
| 0.8097222222222222 | 0 |
| 0.8104166666666667 | 0 |
| 0.811111111111111 | 0 |
| 0.8118055555555556 | 0 |
| 0.8125 | 0 |
| 0.8131944444444444 | 0 |
| 0.813888888888889 | 0 |
| 0.8145833333333333 | 0 |
| 0.8152777777777778 | 0 |
| 0.8159722222222222 | 0 |
| 0.8166666666666668 | 0 |
| 0.8173611111111111 | 0 |
| 0.8180555555555555 | 0 |
| 0.81875 | 0 |
| 0.8194444444444445 | 0 |
| 0.8201388888888889 | 0 |
| 0.8208333333333333 | 0 |
| 0.8215277777777777 | 0 |
| 0.8222222222222223 | 0 |
| 0.8229166666666666 | 0 |
| 0.8236111111111111 | 0 |
| 0.8243055555555556 | 0 |
| 0.8250000000000001 | 0 |
| 0.8256944444444444 | 0 |
| 0.8263888888888888 | 0 |
| 0.8270833333333334 | 0 |
| 0.8277777777777778 | 0 |
| 0.8284722222222222 | 0 |
| 0.8291666666666666 | 0 |
| 0.8298611111111112 | 0 |
| 0.8305555555555556 | 0 |
| 0.8312499999999999 | 0 |
| 0.8319444444444444 | 0 |
| 0.8326388888888889 | 0 |
| 0.8333333333333334 | 0 |
| 0.8340277777777777 | 0 |
| 0.8347222222222223 | 0 |
| 0.8354166666666667 | 0 |
| 0.8361111111111111 | 0 |
| 0.8368055555555555 | 0 |
| 0.8375 | 0 |
| 0.8381944444444445 | 0 |
| 0.8388888888888889 | 0 |
| 0.8395833333333332 | 0 |
| 0.8402777777777778 | 0 |
| 0.8409722222222222 | 0 |
| 0.8416666666666667 | 0 |
| 0.842361111111111 | 0 |
| 0.8430555555555556 | 0 |
| 0.84375 | 0 |
| 0.8444444444444444 | 0 |
| 0.845138888888889 | 0 |
| 0.8458333333333333 | 0 |
| 0.8465277777777778 | 0 |
| 0.8472222222222222 | 0 |
| 0.8479166666666668 | 0 |
| 0.8486111111111111 | 0 |
| 0.8493055555555555 | 0 |
| 0.85 | 0 |
| 0.8506944444444445 | 0 |
| 0.8513888888888889 | 0 |
| 0.8520833333333333 | 0 |
| 0.8527777777777777 | 0 |
| 0.8534722222222223 | 0 |
| 0.8541666666666666 | 0 |
| 0.8548611111111111 | 0 |
| 0.8555555555555556 | 0 |
| 0.8562500000000001 | 0 |
| 0.8569444444444444 | 0 |
| 0.8576388888888888 | 0 |
| 0.8583333333333334 | 0 |
| 0.8590277777777778 | 0 |
| 0.8597222222222222 | 0 |
| 0.8604166666666666 | 0 |
| 0.8611111111111112 | 0 |
| 0.8618055555555556 | 0 |
| 0.8624999999999999 | 0 |
| 0.8631944444444444 | 0 |
| 0.8638888888888889 | 0 |
| 0.8645833333333334 | 0 |
| 0.8652777777777777 | 0 |
| 0.8659722222222223 | 0 |
| 0.8666666666666667 | 0 |
| 0.8673611111111111 | 0 |
| 0.8680555555555555 | 0 |
| 0.86875 | 0 |
| 0.8694444444444445 | 0 |
| 0.8701388888888889 | 0 |
| 0.8708333333333332 | 0 |
| 0.8715277777777778 | 0 |
| 0.8722222222222222 | 0 |
| 0.8729166666666667 | 0 |
| 0.873611111111111 | 0 |
| 0.8743055555555556 | 0 |
| 0.875 | 0 |
| 0.8756944444444444 | 0 |
| 0.876388888888889 | 0 |
| 0.8770833333333333 | 0 |
| 0.8777777777777778 | 0 |
| 0.8784722222222222 | 0 |
| 0.8791666666666668 | 0 |
| 0.8798611111111111 | 0 |
| 0.8805555555555555 | 0 |
| 0.88125 | 0 |
| 0.8819444444444445 | 0 |
| 0.8826388888888889 | 0 |
| 0.8833333333333333 | 0 |
| 0.8840277777777777 | 0 |
| 0.8847222222222223 | 0 |
| 0.8854166666666666 | 0 |
| 0.8861111111111111 | 0 |
| 0.8868055555555556 | 0 |
| 0.8875000000000001 | 0 |
| 0.8881944444444444 | 0 |
| 0.8888888888888888 | 0 |
| 0.8895833333333334 | 0 |
| 0.8902777777777778 | 0 |
| 0.8909722222222222 | 0 |
| 0.8916666666666666 | 0 |
| 0.8923611111111112 | 0 |
| 0.8930555555555556 | 0 |
| 0.8937499999999999 | 0 |
| 0.8944444444444444 | 0 |
| 0.8951388888888889 | 0 |
| 0.8958333333333334 | 0 |
| 0.8965277777777777 | 0 |
| 0.8972222222222223 | 0 |
| 0.8979166666666667 | 0 |
| 0.8986111111111111 | 0 |
| 0.8993055555555555 | 0 |
| 0.9 | 0 |
| 0.9006944444444445 | 0 |
| 0.9013888888888889 | 0 |
| 0.9020833333333332 | 0 |
| 0.9027777777777778 | 0 |
| 0.9034722222222222 | 0 |
| 0.9041666666666667 | 0 |
| 0.904861111111111 | 0 |
| 0.9055555555555556 | 0 |
| 0.90625 | 0 |
| 0.9069444444444444 | 0 |
| 0.907638888888889 | 0 |
| 0.9083333333333333 | 0 |
| 0.9090277777777778 | 0 |
| 0.9097222222222222 | 0 |
| 0.9104166666666668 | 0 |
| 0.9111111111111111 | 0 |
| 0.9118055555555555 | 0 |
| 0.9125 | 0 |
| 0.9131944444444445 | 0 |
| 0.9138888888888889 | 0 |
| 0.9145833333333333 | 0 |
| 0.9152777777777777 | 0 |
| 0.9159722222222223 | 0 |
| 0.9166666666666666 | 0 |
| 0.9173611111111111 | 0 |
| 0.9180555555555556 | 0 |
| 0.9187500000000001 | 0 |
| 0.9194444444444444 | 0 |
| 0.9201388888888888 | 0 |
| 0.9208333333333334 | 0 |
| 0.9215277777777778 | 0 |
| 0.9222222222222222 | 0 |
| 0.9229166666666666 | 0 |
| 0.9236111111111112 | 0 |
| 0.9243055555555556 | 0 |
| 0.9249999999999999 | 0 |
| 0.9256944444444444 | 0 |
| 0.9263888888888889 | 0 |
| 0.9270833333333334 | 0 |
| 0.9277777777777777 | 0 |
| 0.9284722222222223 | 0 |
| 0.9291666666666667 | 0 |
| 0.9298611111111111 | 0 |
| 0.9305555555555555 | 0 |
| 0.93125 | 0 |
| 0.9319444444444445 | 0 |
| 0.9326388888888889 | 0 |
| 0.9333333333333332 | 0 |
| 0.9340277777777778 | 0 |
| 0.9347222222222222 | 0 |
| 0.9354166666666667 | 0 |
| 0.936111111111111 | 0 |
| 0.9368055555555556 | 0 |
| 0.9375 | 0 |
| 0.9381944444444444 | 0 |
| 0.938888888888889 | 0 |
| 0.9395833333333333 | 0 |
| 0.9402777777777778 | 0 |
| 0.9409722222222222 | 0 |
| 0.9416666666666668 | 0 |
| 0.9423611111111111 | 0 |
| 0.9430555555555555 | 0 |
| 0.94375 | 0 |
| 0.9444444444444445 | 0 |
| 0.9451388888888889 | 0 |
| 0.9458333333333333 | 0 |
| 0.9465277777777777 | 0 |
| 0.9472222222222223 | 0 |
| 0.9479166666666666 | 0 |
| 0.9486111111111111 | 0 |
| 0.9493055555555556 | 0 |
| 0.9500000000000001 | 0 |
| 0.9506944444444444 | 0 |
| 0.9513888888888888 | 0 |
| 0.9520833333333334 | 0 |
| 0.9527777777777778 | 0 |
| 0.9534722222222222 | 0 |
| 0.9541666666666666 | 0 |
| 0.9548611111111112 | 0 |
| 0.9555555555555556 | 0 |
| 0.9562499999999999 | 0 |
| 0.9569444444444444 | 0 |
| 0.9576388888888889 | 0 |
| 0.9583333333333334 | 0 |
| 0.9590277777777777 | 0 |
| 0.9597222222222223 | 0 |
| 0.9604166666666667 | 0 |
| 0.9611111111111111 | 0 |
| 0.9618055555555555 | 0 |
| 0.9625 | 0 |
| 0.9631944444444445 | 0 |
| 0.9638888888888889 | 0 |
| 0.9645833333333332 | 0 |
| 0.9652777777777778 | 0 |
| 0.9659722222222222 | 0 |
| 0.9666666666666667 | 0 |
| 0.967361111111111 | 0 |
| 0.9680555555555556 | 0 |
| 0.96875 | 0 |
| 0.9694444444444444 | 0 |
| 0.970138888888889 | 0 |
| 0.9708333333333333 | 0 |
| 0.9715277777777778 | 0 |
| 0.9722222222222222 | 0 |
| 0.9729166666666668 | 0 |
| 0.9736111111111111 | 0 |
| 0.9743055555555555 | 0 |
| 0.975 | 0 |
| 0.9756944444444445 | 0 |
| 0.9763888888888889 | 0 |
| 0.9770833333333333 | 0 |
| 0.9777777777777777 | 0 |
| 0.9784722222222223 | 0 |
| 0.9791666666666666 | 0 |
| 0.9798611111111111 | 0 |
| 0.9805555555555556 | 0 |
| 0.9812500000000001 | 0 |
| 0.9819444444444444 | 0 |
| 0.9826388888888888 | 0 |
| 0.9833333333333334 | 0 |
| 0.9840277777777778 | 0 |
| 0.9847222222222222 | 0 |
| 0.9854166666666666 | 0 |
| 0.9861111111111112 | 0 |
| 0.9868055555555556 | 0 |
| 0.9874999999999999 | 0 |
| 0.9881944444444444 | 0 |
| 0.9888888888888889 | 0 |
| 0.9895833333333334 | 0 |
| 0.9902777777777777 | 0 |
| 0.9909722222222223 | 0 |
| 0.9916666666666667 | 0 |
| 0.9923611111111111 | 0 |
| 0.9930555555555555 | 0 |
| 0.99375 | 0 |
| 0.9944444444444445 | 0 |
| 0.9951388888888889 | 0 |
| 0.9958333333333332 | 0 |
| 0.9965277777777778 | 0 |
| 0.9972222222222222 | 0 |
| 0.9979166666666667 | 0 |
| 0.998611111111111 | 0 |
| 0.9993055555555556 | 0 |